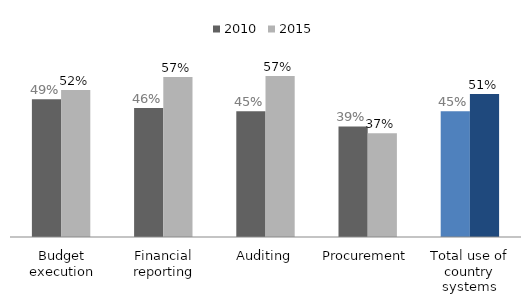
| Category | 2010 | 2015 |
|---|---|---|
| Budget execution | 0.49 | 0.523 |
| Financial reporting | 0.459 | 0.568 |
| Auditing | 0.447 | 0.572 |
| Procurement | 0.393 | 0.368 |
| Total use of country systems | 0.447 | 0.508 |